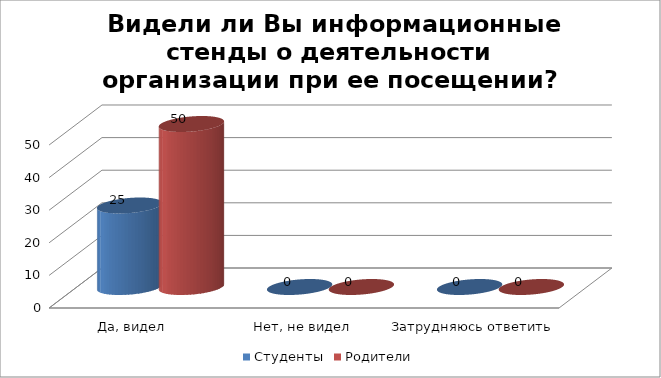
| Category | Студенты | Родители |
|---|---|---|
| Да, видел | 25 | 50 |
| Нет, не видел | 0 | 0 |
| Затрудняюсь ответить | 0 | 0 |